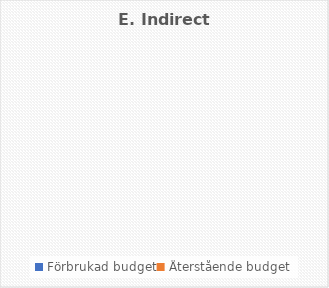
| Category | E. Indirect costs |
|---|---|
| Förbrukad budget | 0 |
| Återstående budget | 0 |